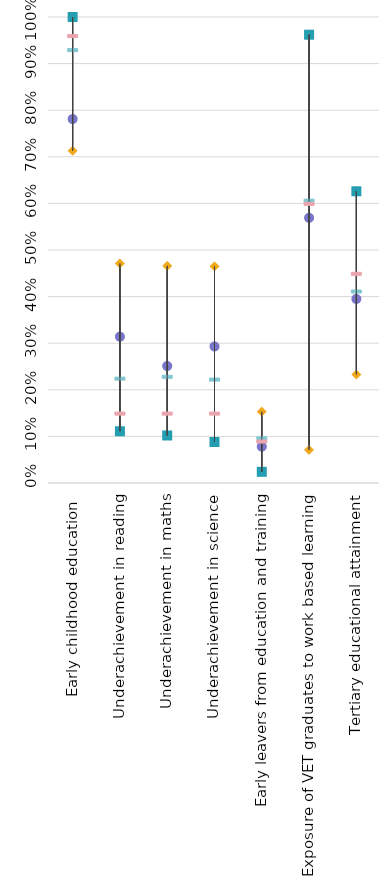
| Category | Slovakia | Strongest performer | Weakest performer | EU average | EU target |
|---|---|---|---|---|---|
| Early childhood education  | 0.781 | 1 | 0.713 | 0.93 | 0.96 |
| Underachievement in reading | 0.314 | 0.111 | 0.471 | 0.225 | 0.15 |
| Underachievement in maths | 0.251 | 0.102 | 0.466 | 0.229 | 0.15 |
| Underachievement in science | 0.293 | 0.088 | 0.465 | 0.223 | 0.15 |
| Early leavers from education and training | 0.078 | 0.024 | 0.153 | 0.097 | 0.09 |
| Exposure of VET graduates to work based learning  | 0.569 | 0.962 | 0.071 | 0.607 | 0.6 |
| Tertiary educational attainment | 0.395 | 0.626 | 0.233 | 0.412 | 0.45 |